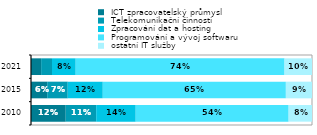
| Category |  ICT zpracovatelský průmysl |  Telekomunikační činnosti  |  Zpracování dat a hosting |  Programování a vývoj softwaru |  ostatní IT služby  |
|---|---|---|---|---|---|
| 2010.0 | 0.124 | 0.108 | 0.141 | 0.544 | 0.083 |
| 2015.0 | 0.058 | 0.073 | 0.125 | 0.652 | 0.093 |
| 2021.0 | 0.036 | 0.039 | 0.084 | 0.743 | 0.098 |